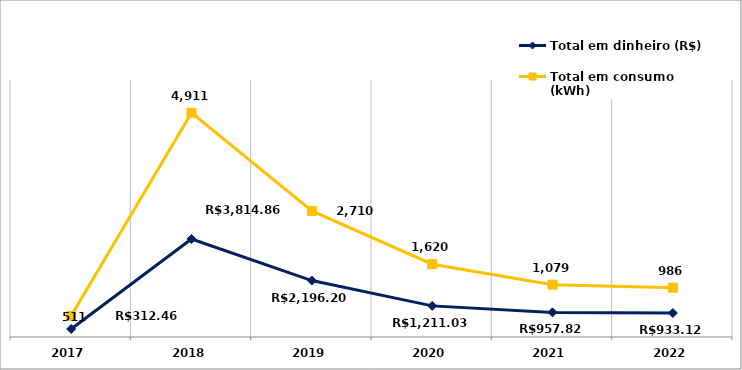
| Category | Total em dinheiro (R$) | Total em consumo (kWh) |
|---|---|---|
| 2017.0 | 312.46 | 511 |
| 2018.0 | 3814.86 | 4911 |
| 2019.0 | 2196.2 | 2710 |
| 2020.0 | 1211.03 | 1620 |
| 2021.0 | 957.82 | 1079 |
| 2022.0 | 933.12 | 986 |